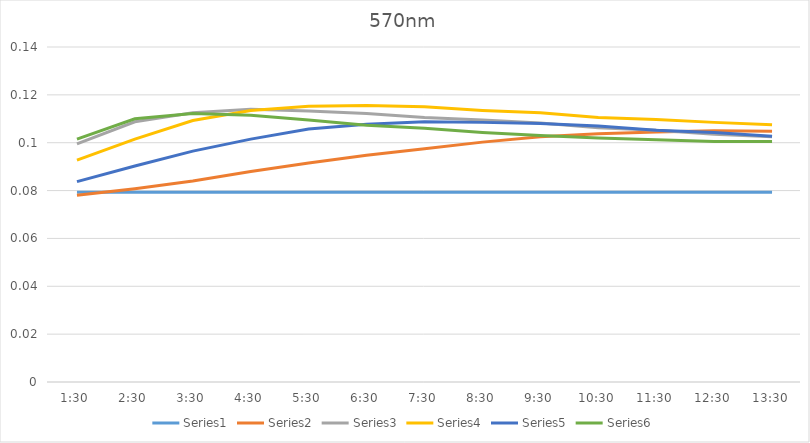
| Category | Series 0 | Series 1 | Series 2 | Series 3 | Series 4 | Series 5 |
|---|---|---|---|---|---|---|
| 0.0625 | 0.079 | 0.078 | 0.1 | 0.093 | 0.084 | 0.102 |
| 0.104166666666667 | 0.079 | 0.081 | 0.109 | 0.102 | 0.09 | 0.11 |
| 0.145833333333333 | 0.079 | 0.084 | 0.112 | 0.109 | 0.096 | 0.112 |
| 0.1875 | 0.079 | 0.088 | 0.114 | 0.114 | 0.102 | 0.112 |
| 0.229166666666667 | 0.079 | 0.092 | 0.113 | 0.115 | 0.106 | 0.11 |
| 0.270833333333333 | 0.079 | 0.095 | 0.112 | 0.116 | 0.108 | 0.107 |
| 0.3125 | 0.079 | 0.098 | 0.11 | 0.115 | 0.109 | 0.106 |
| 0.354166666666667 | 0.079 | 0.1 | 0.11 | 0.114 | 0.108 | 0.104 |
| 0.395833333333333 | 0.079 | 0.102 | 0.108 | 0.112 | 0.108 | 0.103 |
| 0.4375 | 0.079 | 0.104 | 0.106 | 0.11 | 0.107 | 0.102 |
| 0.479166666666667 | 0.079 | 0.104 | 0.105 | 0.11 | 0.105 | 0.101 |
| 0.520833333333333 | 0.079 | 0.105 | 0.104 | 0.108 | 0.104 | 0.1 |
| 0.5625 | 0.079 | 0.105 | 0.102 | 0.108 | 0.103 | 0.1 |